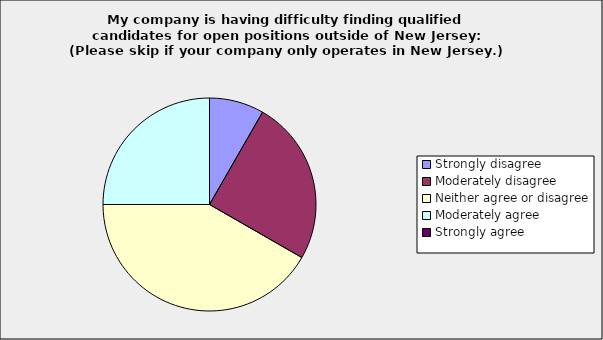
| Category | Series 0 |
|---|---|
| Strongly disagree | 0.083 |
| Moderately disagree | 0.25 |
| Neither agree or disagree | 0.417 |
| Moderately agree | 0.25 |
| Strongly agree | 0 |